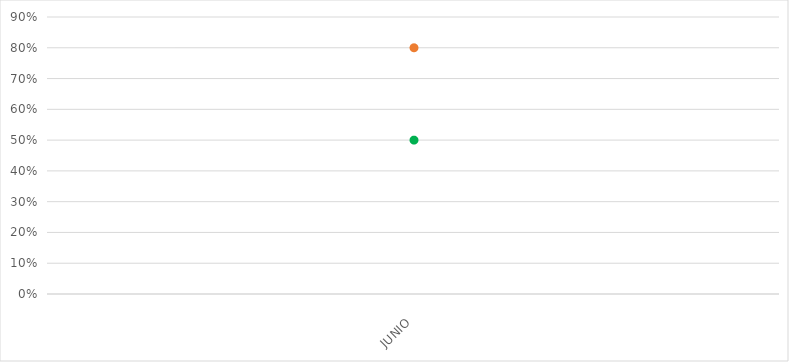
| Category | VALOR  | META PONDERADA |
|---|---|---|
| JUNIO | 0.8 | 0.5 |